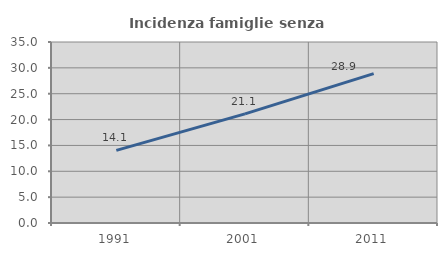
| Category | Incidenza famiglie senza nuclei |
|---|---|
| 1991.0 | 14.054 |
| 2001.0 | 21.098 |
| 2011.0 | 28.872 |